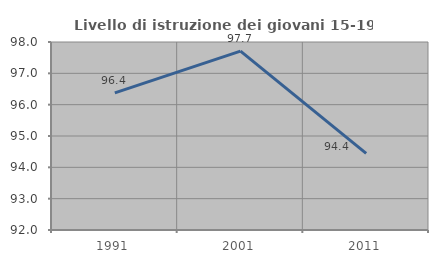
| Category | Livello di istruzione dei giovani 15-19 anni |
|---|---|
| 1991.0 | 96.377 |
| 2001.0 | 97.71 |
| 2011.0 | 94.444 |